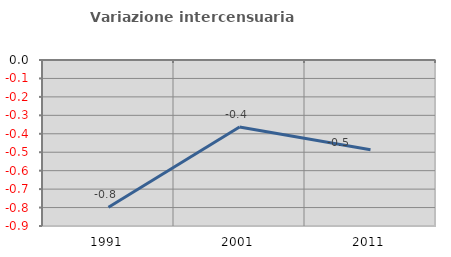
| Category | Variazione intercensuaria annua |
|---|---|
| 1991.0 | -0.798 |
| 2001.0 | -0.363 |
| 2011.0 | -0.486 |